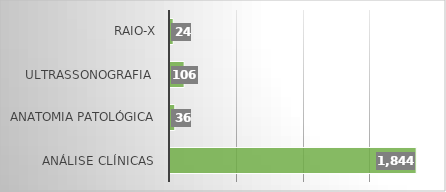
| Category | Series 0 |
|---|---|
| Análise Clínicas  | 1844 |
| Anatomia Patológica | 36 |
| Ultrassonografia  | 106 |
| RAIO-X | 24 |